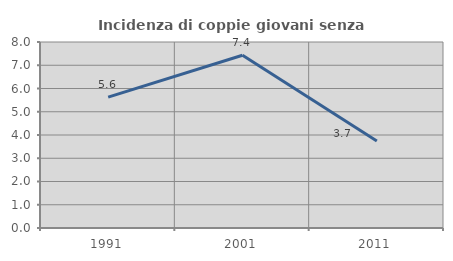
| Category | Incidenza di coppie giovani senza figli |
|---|---|
| 1991.0 | 5.628 |
| 2001.0 | 7.432 |
| 2011.0 | 3.744 |